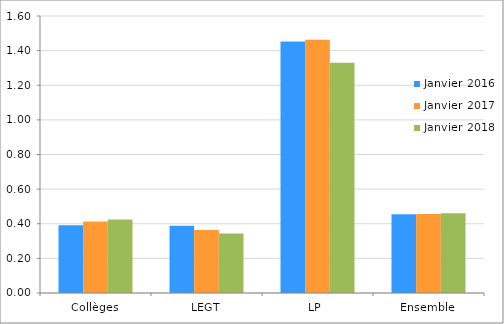
| Category | Janvier 2016 | Janvier 2017 | Janvier 2018 |
|---|---|---|---|
| Collèges | 0.392 | 0.413 | 0.424 |
| LEGT | 0.388 | 0.363 | 0.344 |
| LP  | 1.453 | 1.462 | 1.331 |
| Ensemble | 0.455 | 0.456 | 0.461 |